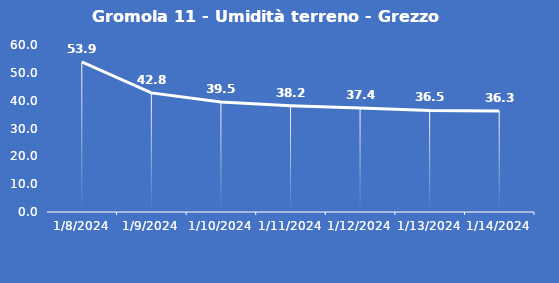
| Category | Gromola 11 - Umidità terreno - Grezzo (%VWC) |
|---|---|
| 1/8/24 | 53.9 |
| 1/9/24 | 42.8 |
| 1/10/24 | 39.5 |
| 1/11/24 | 38.2 |
| 1/12/24 | 37.4 |
| 1/13/24 | 36.5 |
| 1/14/24 | 36.3 |